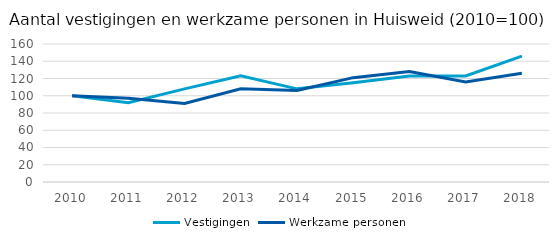
| Category | Vestigingen | Werkzame personen |
|---|---|---|
| 2010.0 | 100 | 100 |
| 2011.0 | 92 | 97 |
| 2012.0 | 108 | 91 |
| 2013.0 | 123 | 108 |
| 2014.0 | 108 | 106 |
| 2015.0 | 115 | 121 |
| 2016.0 | 123 | 128 |
| 2017.0 | 123 | 116 |
| 2018.0 | 146 | 126 |